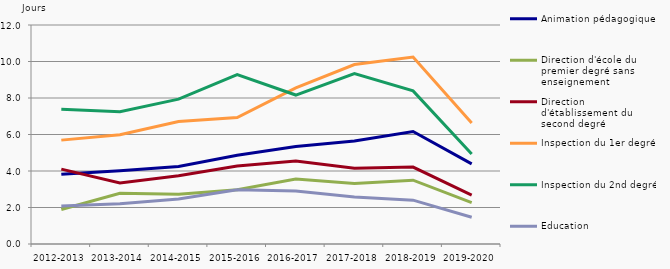
| Category | Animation pédagogique | Direction d'école du premier degré sans enseignement | Direction d'établissement du second degré | Inspection du 1er degré | Inspection du 2nd degré | Education |
|---|---|---|---|---|---|---|
| 2012-2013 | 3.815 | 1.888 | 4.103 | 5.692 | 7.382 | 2.084 |
| 2013-2014 | 4.019 | 2.78 | 3.345 | 5.987 | 7.25 | 2.21 |
| 2014-2015 | 4.243 | 2.727 | 3.744 | 6.712 | 7.938 | 2.462 |
| 2015-2016 | 4.865 | 2.971 | 4.276 | 6.926 | 9.281 | 2.97 |
| 2016-2017 | 5.341 | 3.556 | 4.554 | 8.55 | 8.162 | 2.904 |
| 2017-2018 | 5.643 | 3.313 | 4.152 | 9.834 | 9.333 | 2.574 |
| 2018-2019 | 6.162 | 3.498 | 4.217 | 10.244 | 8.388 | 2.403 |
| 2019-2020 | 4.39 | 2.272 | 2.681 | 6.631 | 4.935 | 1.463 |